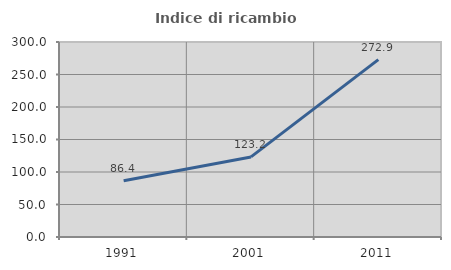
| Category | Indice di ricambio occupazionale  |
|---|---|
| 1991.0 | 86.429 |
| 2001.0 | 123.181 |
| 2011.0 | 272.889 |